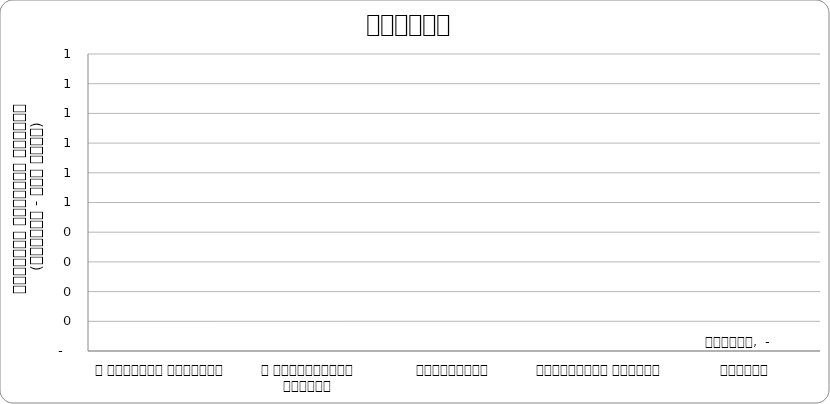
| Category | शिक्षा |
|---|---|
| द हिमालयन टाइम्स् | 0 |
| द काठमाण्डौं पोस्ट् | 0 |
| कान्तिपुर | 0 |
| अन्नपूर्ण पोस्ट् | 0 |
| नागरिक | 0 |